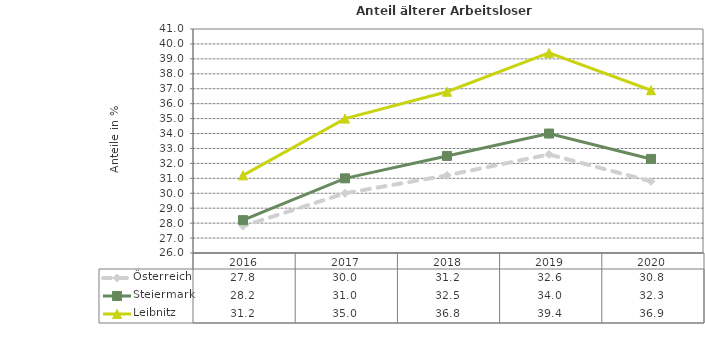
| Category | Österreich | Steiermark | Leibnitz |
|---|---|---|---|
| 2020.0 | 30.8 | 32.3 | 36.9 |
| 2019.0 | 32.6 | 34 | 39.4 |
| 2018.0 | 31.2 | 32.5 | 36.8 |
| 2017.0 | 30 | 31 | 35 |
| 2016.0 | 27.8 | 28.2 | 31.2 |